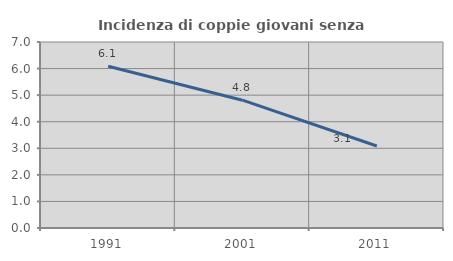
| Category | Incidenza di coppie giovani senza figli |
|---|---|
| 1991.0 | 6.087 |
| 2001.0 | 4.81 |
| 2011.0 | 3.087 |